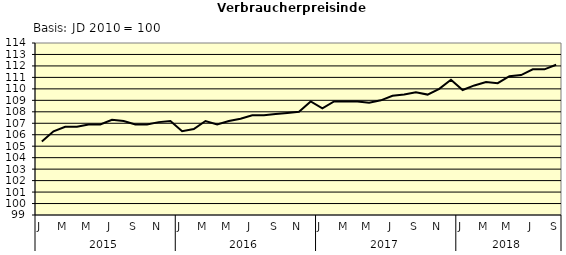
| Category | Series 0 |
|---|---|
| 0 | 105.4 |
| 1 | 106.3 |
| 2 | 106.7 |
| 3 | 106.7 |
| 4 | 106.9 |
| 5 | 106.9 |
| 6 | 107.3 |
| 7 | 107.2 |
| 8 | 106.9 |
| 9 | 106.9 |
| 10 | 107.1 |
| 11 | 107.2 |
| 12 | 106.3 |
| 13 | 106.5 |
| 14 | 107.2 |
| 15 | 106.9 |
| 16 | 107.2 |
| 17 | 107.4 |
| 18 | 107.7 |
| 19 | 107.7 |
| 20 | 107.8 |
| 21 | 107.9 |
| 22 | 108 |
| 23 | 108.9 |
| 24 | 108.3 |
| 25 | 108.9 |
| 26 | 108.9 |
| 27 | 108.9 |
| 28 | 108.8 |
| 29 | 109 |
| 30 | 109.4 |
| 31 | 109.5 |
| 32 | 109.7 |
| 33 | 109.5 |
| 34 | 110 |
| 35 | 110.8 |
| 36 | 109.9 |
| 37 | 110.3 |
| 38 | 110.6 |
| 39 | 110.5 |
| 40 | 111.1 |
| 41 | 111.2 |
| 42 | 111.7 |
| 43 | 111.7 |
| 44 | 112.1 |